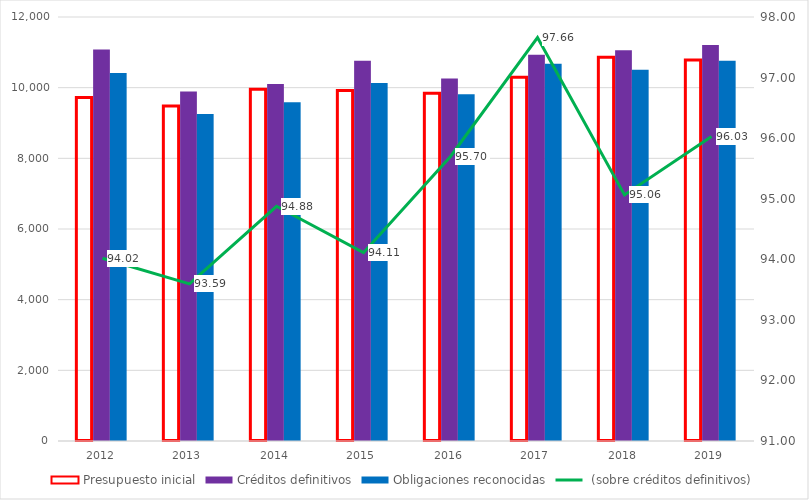
| Category | Presupuesto inicial | Créditos definitivos | Obligaciones reconocidas |
|---|---|---|---|
| 2012.0 | 9720.048 | 11079.939 | 10417.058 |
| 2013.0 | 9481.615 | 9890.285 | 9256.78 |
| 2014.0 | 9957.791 | 10105.328 | 9587.465 |
| 2015.0 | 9920.812 | 10763.44 | 10129.37 |
| 2016.0 | 9843.699 | 10256.08 | 9814.755 |
| 2017.0 | 10293.186 | 10933.955 | 10678.117 |
| 2018.0 | 10859.22 | 11055.9 | 10509.97 |
| 2019.0 | 10784.98 | 11204.58 | 10759.35 |